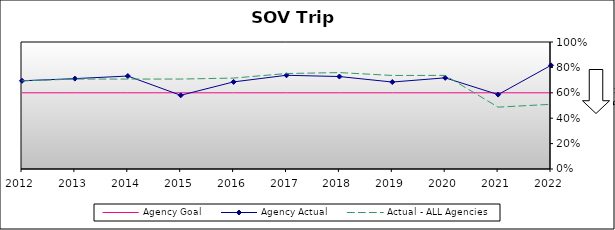
| Category | Agency Goal | Agency Actual | Actual - ALL Agencies |
|---|---|---|---|
| 2012.0 | 0.6 | 0.695 | 0.694 |
| 2013.0 | 0.6 | 0.712 | 0.708 |
| 2014.0 | 0.6 | 0.732 | 0.708 |
| 2015.0 | 0.6 | 0.58 | 0.708 |
| 2016.0 | 0.6 | 0.686 | 0.716 |
| 2017.0 | 0.6 | 0.738 | 0.752 |
| 2018.0 | 0.6 | 0.728 | 0.759 |
| 2019.0 | 0.6 | 0.685 | 0.736 |
| 2020.0 | 0.6 | 0.718 | 0.737 |
| 2021.0 | 0.6 | 0.586 | 0.487 |
| 2022.0 | 0.6 | 0.816 | 0.509 |